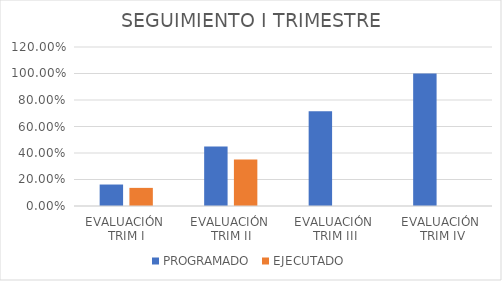
| Category | PROGRAMADO | EJECUTADO |
|---|---|---|
| EVALUACIÓN 
TRIM I | 0.162 | 0.137 |
| EVALUACIÓN 
TRIM II | 0.448 | 0.35 |
| EVALUACIÓN 
TRIM III | 0.715 | 0 |
| EVALUACIÓN
 TRIM IV | 1 | 0 |